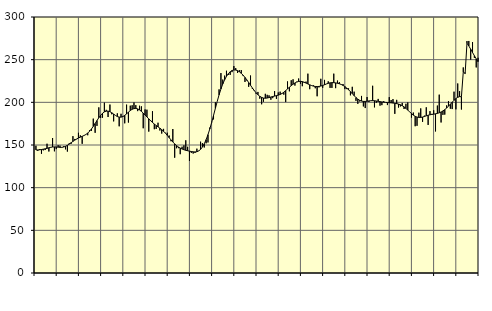
| Category | Piggar | Series 1 |
|---|---|---|
| nan | 149.1 | 144.2 |
| 1.0 | 143.1 | 144.2 |
| 1.0 | 145.3 | 144.4 |
| 1.0 | 139.7 | 144.72 |
| 1.0 | 143.7 | 145.1 |
| 1.0 | 144.1 | 145.56 |
| 1.0 | 151.5 | 146.1 |
| 1.0 | 142.4 | 146.74 |
| 1.0 | 147 | 147.3 |
| 1.0 | 158.2 | 147.66 |
| 1.0 | 142.6 | 147.77 |
| 1.0 | 145.2 | 147.68 |
| nan | 149.8 | 147.46 |
| 2.0 | 149.3 | 147.24 |
| 2.0 | 147 | 147.25 |
| 2.0 | 148.5 | 147.62 |
| 2.0 | 144.9 | 148.42 |
| 2.0 | 142.3 | 149.6 |
| 2.0 | 152.1 | 151.05 |
| 2.0 | 151.3 | 152.65 |
| 2.0 | 160.4 | 154.23 |
| 2.0 | 157.1 | 155.7 |
| 2.0 | 156.8 | 157.04 |
| 2.0 | 164.3 | 158.21 |
| nan | 161.3 | 159.2 |
| 3.0 | 151.4 | 160.14 |
| 3.0 | 161.2 | 161.12 |
| 3.0 | 162.5 | 162.33 |
| 3.0 | 161.4 | 163.97 |
| 3.0 | 167.3 | 166.14 |
| 3.0 | 166.6 | 168.78 |
| 3.0 | 180.9 | 171.86 |
| 3.0 | 164.3 | 175.22 |
| 3.0 | 172.4 | 178.63 |
| 3.0 | 194.1 | 181.92 |
| 3.0 | 181.7 | 184.84 |
| nan | 182 | 187.16 |
| 4.0 | 199.6 | 188.81 |
| 4.0 | 191.2 | 189.66 |
| 4.0 | 182.8 | 189.71 |
| 4.0 | 197.4 | 189.04 |
| 4.0 | 186 | 187.8 |
| 4.0 | 177.7 | 186.24 |
| 4.0 | 184.7 | 184.66 |
| 4.0 | 187.1 | 183.38 |
| 4.0 | 171.9 | 182.69 |
| 4.0 | 186.6 | 182.64 |
| 4.0 | 182.8 | 183.33 |
| nan | 175.4 | 184.71 |
| 5.0 | 197.3 | 186.5 |
| 5.0 | 176.3 | 188.46 |
| 5.0 | 196.1 | 190.36 |
| 5.0 | 196.6 | 191.83 |
| 5.0 | 199.8 | 192.67 |
| 5.0 | 196.7 | 192.83 |
| 5.0 | 189.7 | 192.31 |
| 5.0 | 196 | 191.13 |
| 5.0 | 195.3 | 189.45 |
| 5.0 | 169.6 | 187.43 |
| 5.0 | 191.7 | 185.19 |
| nan | 191.4 | 182.88 |
| 6.0 | 165.7 | 180.61 |
| 6.0 | 179.1 | 178.46 |
| 6.0 | 189.6 | 176.44 |
| 6.0 | 168.5 | 174.57 |
| 6.0 | 168.8 | 172.86 |
| 6.0 | 176.1 | 171.27 |
| 6.0 | 167 | 169.69 |
| 6.0 | 163.4 | 168.01 |
| 6.0 | 168.9 | 166.08 |
| 6.0 | 164.3 | 163.85 |
| 6.0 | 164.4 | 161.34 |
| nan | 161.1 | 158.66 |
| 7.0 | 154.4 | 156.01 |
| 7.0 | 168.7 | 153.55 |
| 7.0 | 135.1 | 151.31 |
| 7.0 | 146.2 | 149.32 |
| 7.0 | 146.3 | 147.69 |
| 7.0 | 139.2 | 146.37 |
| 7.0 | 148 | 145.29 |
| 7.0 | 149.6 | 144.45 |
| 7.0 | 155.5 | 143.79 |
| 7.0 | 147.9 | 143.27 |
| 7.0 | 131.3 | 142.8 |
| nan | 140.8 | 142.36 |
| 8.0 | 140 | 142.01 |
| 8.0 | 140.7 | 141.87 |
| 8.0 | 145.7 | 142.13 |
| 8.0 | 143.3 | 143.07 |
| 8.0 | 153.9 | 144.85 |
| 8.0 | 152.2 | 147.62 |
| 8.0 | 147.1 | 151.45 |
| 8.0 | 152 | 156.29 |
| 8.0 | 153 | 162.12 |
| 8.0 | 170.4 | 168.87 |
| 8.0 | 177.2 | 176.46 |
| nan | 180 | 184.62 |
| 9.0 | 200.1 | 192.95 |
| 9.0 | 201.1 | 201.11 |
| 9.0 | 215.2 | 208.76 |
| 9.0 | 234.3 | 215.61 |
| 9.0 | 226.7 | 221.53 |
| 9.0 | 231.3 | 226.45 |
| 9.0 | 237 | 230.43 |
| 9.0 | 232.1 | 233.56 |
| 9.0 | 232.2 | 235.83 |
| 9.0 | 235.4 | 237.27 |
| 9.0 | 242.5 | 237.91 |
| nan | 240.1 | 237.85 |
| 10.0 | 234.4 | 237.13 |
| 10.0 | 237.6 | 235.79 |
| 10.0 | 237.8 | 233.98 |
| 10.0 | 230.8 | 231.78 |
| 10.0 | 223.9 | 229.23 |
| 10.0 | 225.6 | 226.34 |
| 10.0 | 218.2 | 223.2 |
| 10.0 | 231.4 | 219.97 |
| 10.0 | 215.6 | 216.82 |
| 10.0 | 213.3 | 213.85 |
| 10.0 | 210.1 | 211.18 |
| nan | 212.2 | 208.89 |
| 11.0 | 204.3 | 207.07 |
| 11.0 | 197.7 | 205.77 |
| 11.0 | 200.7 | 205 |
| 11.0 | 210 | 204.8 |
| 11.0 | 208.8 | 205.05 |
| 11.0 | 208.2 | 205.6 |
| 11.0 | 203 | 206.25 |
| 11.0 | 204.9 | 206.84 |
| 11.0 | 213.2 | 207.33 |
| 11.0 | 204 | 207.83 |
| 11.0 | 211.6 | 208.42 |
| nan | 212.5 | 209.21 |
| 12.0 | 210.7 | 210.33 |
| 12.0 | 209 | 211.86 |
| 12.0 | 200.3 | 213.72 |
| 12.0 | 224.5 | 215.71 |
| 12.0 | 212.9 | 217.68 |
| 12.0 | 225.9 | 219.56 |
| 12.0 | 227 | 221.26 |
| 12.0 | 219.6 | 222.69 |
| 12.0 | 224.2 | 223.78 |
| 12.0 | 227.9 | 224.45 |
| 12.0 | 221.8 | 224.62 |
| nan | 218.9 | 224.3 |
| 13.0 | 222.8 | 223.58 |
| 13.0 | 224.3 | 222.6 |
| 13.0 | 233.6 | 221.53 |
| 13.0 | 215.4 | 220.52 |
| 13.0 | 219.5 | 219.66 |
| 13.0 | 219.9 | 219 |
| 13.0 | 216.5 | 218.58 |
| 13.0 | 207.1 | 218.45 |
| 13.0 | 217.5 | 218.63 |
| 13.0 | 227.6 | 219.09 |
| 13.0 | 217 | 219.76 |
| nan | 226.3 | 220.61 |
| 14.0 | 221.6 | 221.5 |
| 14.0 | 224.6 | 222.27 |
| 14.0 | 216.9 | 222.83 |
| 14.0 | 216.9 | 223.08 |
| 14.0 | 233.6 | 223.05 |
| 14.0 | 216.6 | 222.78 |
| 14.0 | 225.5 | 222.33 |
| 14.0 | 223.7 | 221.75 |
| 14.0 | 220.7 | 220.96 |
| 14.0 | 221.5 | 219.86 |
| 14.0 | 215.5 | 218.46 |
| nan | 215.5 | 216.75 |
| 15.0 | 216.4 | 214.75 |
| 15.0 | 208.2 | 212.53 |
| 15.0 | 218.2 | 210.15 |
| 15.0 | 212.5 | 207.8 |
| 15.0 | 201.7 | 205.64 |
| 15.0 | 198.2 | 203.77 |
| 15.0 | 201 | 202.38 |
| 15.0 | 207.5 | 201.49 |
| 15.0 | 195.2 | 201.07 |
| 15.0 | 193.3 | 201.05 |
| 15.0 | 206.2 | 201.3 |
| nan | 200.4 | 201.65 |
| 16.0 | 202 | 201.93 |
| 16.0 | 219.4 | 201.99 |
| 16.0 | 194.1 | 201.87 |
| 16.0 | 199.5 | 201.56 |
| 16.0 | 204 | 201.16 |
| 16.0 | 196.1 | 200.79 |
| 16.0 | 196.7 | 200.44 |
| 16.0 | 201.4 | 200.16 |
| 16.0 | 199.9 | 199.93 |
| 16.0 | 196.8 | 199.76 |
| 16.0 | 206.1 | 199.6 |
| nan | 202.7 | 199.42 |
| 17.0 | 203.8 | 199.17 |
| 17.0 | 186.5 | 198.86 |
| 17.0 | 202.9 | 198.47 |
| 17.0 | 193.9 | 197.97 |
| 17.0 | 195.2 | 197.18 |
| 17.0 | 199.3 | 196.06 |
| 17.0 | 192.2 | 194.63 |
| 17.0 | 198.3 | 192.86 |
| 17.0 | 199.9 | 190.89 |
| 17.0 | 189 | 188.84 |
| 17.0 | 182.1 | 186.83 |
| nan | 188 | 184.99 |
| 18.0 | 172 | 183.59 |
| 18.0 | 172.5 | 182.73 |
| 18.0 | 187.9 | 182.32 |
| 18.0 | 192.9 | 182.32 |
| 18.0 | 177.1 | 182.73 |
| 18.0 | 184.4 | 183.42 |
| 18.0 | 194.2 | 184.21 |
| 18.0 | 173.5 | 184.9 |
| 18.0 | 189.7 | 185.41 |
| 18.0 | 186.5 | 185.8 |
| 18.0 | 190.7 | 186.12 |
| nan | 165.9 | 186.53 |
| 19.0 | 196.2 | 187.04 |
| 19.0 | 209 | 187.72 |
| 19.0 | 176.4 | 188.68 |
| 19.0 | 185.3 | 189.91 |
| 19.0 | 185.6 | 191.44 |
| 19.0 | 196.4 | 193.32 |
| 19.0 | 201.5 | 195.43 |
| 19.0 | 192.5 | 197.75 |
| 19.0 | 192.1 | 200.16 |
| 19.0 | 212.5 | 202.41 |
| 19.0 | 191.8 | 204.4 |
| nan | 222.1 | 205.9 |
| 20.0 | 213.1 | 206.7 |
| 20.0 | 191.6 | 206.57 |
| 20.0 | 240.9 | 235.62 |
| 20.0 | 234.7 | 233.76 |
| 20.0 | 271.8 | 269.28 |
| 20.0 | 271.9 | 266.03 |
| 20.0 | 250.1 | 262.33 |
| 20.0 | 270.6 | 258.44 |
| 20.0 | 252.1 | 254.61 |
| 20.0 | 240.9 | 250.97 |
| 20.0 | 252.2 | 247.59 |